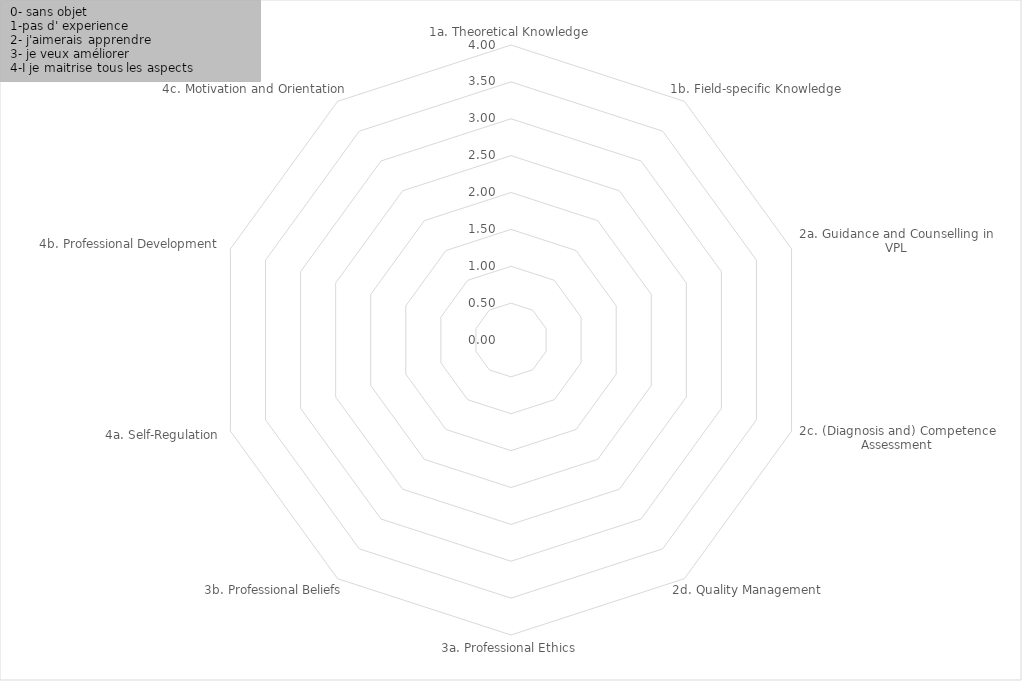
| Category | Series 0 |
|---|---|
| 1a. Theoretical Knowledge | 0 |
| 1b. Field-specific Knowledge | 0 |
| 2a. Guidance and Counselling in VPL | 0 |
| 2c. (Diagnosis and) Competence Assessment | 0 |
| 2d. Quality Management | 0 |
| 3a. Professional Ethics | 0 |
| 3b. Professional Beliefs | 0 |
| 4a. Self-Regulation | 0 |
| 4b. Professional Development | 0 |
| 4c. Motivation and Orientation  | 0 |